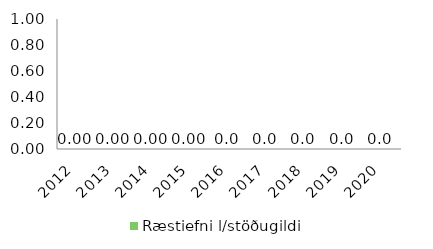
| Category | Ræstiefni l/stöðugildi |
|---|---|
| 2012.0 | 0 |
| 2013.0 | 0 |
| 2014.0 | 0 |
| 2015.0 | 0 |
| 2016.0 | 0 |
| 2017.0 | 0 |
| 2018.0 | 0 |
| 2019.0 | 0 |
| 2020.0 | 0 |